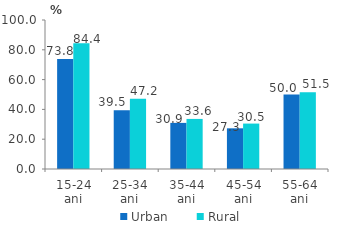
| Category | Urban | Rural |
|---|---|---|
| 15-24 ani | 73.84 | 84.405 |
| 25-34 ani | 39.456 | 47.204 |
| 35-44 ani | 30.946 | 33.608 |
| 45-54 ani | 27.306 | 30.487 |
| 55-64 ani | 49.954 | 51.55 |